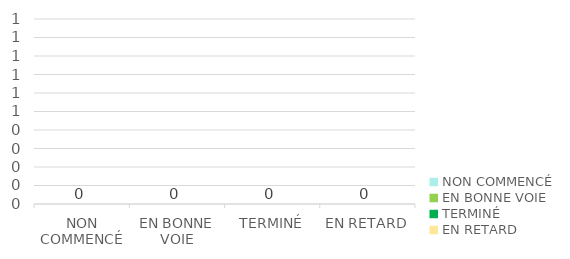
| Category | Series 0 |
|---|---|
| NON COMMENCÉ | 0 |
| EN BONNE VOIE | 0 |
| TERMINÉ | 0 |
| EN RETARD | 0 |